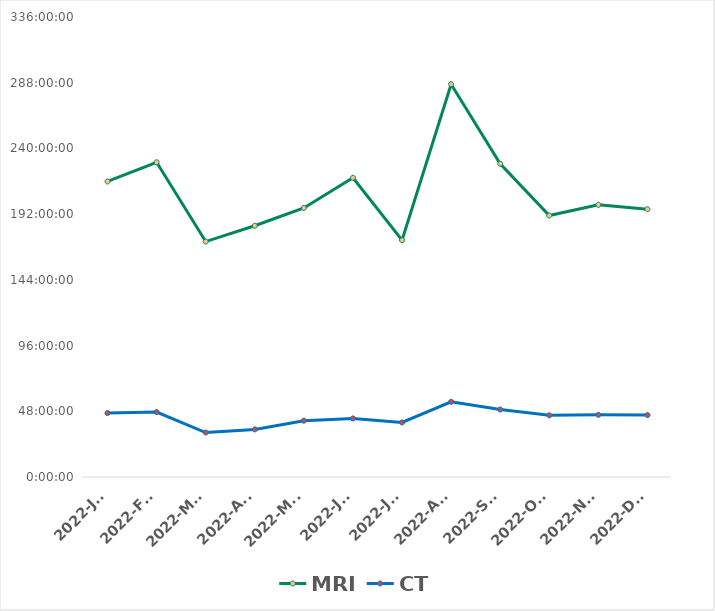
| Category | MRI | CT |
|---|---|---|
| 2022-Jan | 1900-01-08 23:52:00 | 1900-01-01 22:42:00 |
| 2022-Feb | 1900-01-09 13:55:00 | 1900-01-01 23:27:00 |
| 2022-Mar | 1900-01-07 03:58:00 | 1900-01-01 08:28:00 |
| 2022-Apr | 1900-01-07 15:32:00 | 1900-01-01 10:46:00 |
| 2022-May | 1900-01-08 04:31:00 | 1900-01-01 17:07:00 |
| 2022-Jun | 1900-01-09 02:33:00 | 1900-01-01 18:47:00 |
| 2022-Jul | 1900-01-07 05:01:00 | 1900-01-01 15:51:00 |
| 2022-Aug | 1900-01-11 22:53:00 | 1900-01-02 06:55:00 |
| 2022-Sep | 1900-01-09 12:47:00 | 1900-01-02 01:19:00 |
| 2022-Oct | 1900-01-07 22:59:00 | 1900-01-01 21:03:00 |
| 2022-Nov | 1900-01-08 06:48:00 | 1900-01-01 21:25:00 |
| 2022-Dec | 1900-01-08 03:36:00 | 1900-01-01 21:13:00 |